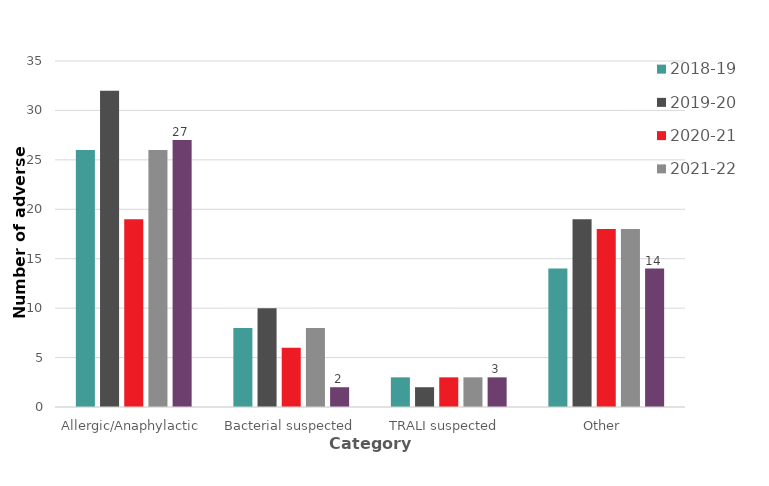
| Category | 2018-19 | 2019-20 | 2020-21 | 2021-22 | 2022-23 |
|---|---|---|---|---|---|
| Allergic/Anaphylactic | 26 | 32 | 19 | 26 | 27 |
| Bacterial suspected | 8 | 10 | 6 | 8 | 2 |
| TRALI suspected  | 3 | 2 | 3 | 3 | 3 |
| Other  | 14 | 19 | 18 | 18 | 14 |